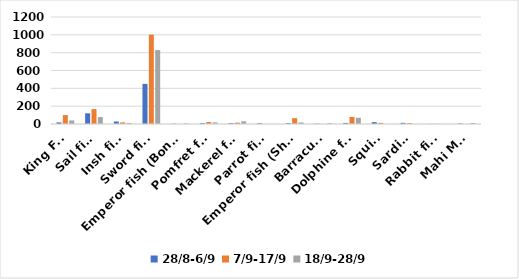
| Category | 28/8-6/9 | 7/9-17/9 | 18/9-28/9 |
|---|---|---|---|
| King Fsh  | 18 | 100 | 40 |
| Sail fish | 120 | 167 | 78 |
| Insh fish | 28 | 18 | 12 |
| Sword fish | 450 | 1002 | 829 |
| Emperor fish (Bonqus) | 3 | 0 | 6 |
| Pomfret fish | 10 | 22 | 18 |
| Mackerel fish | 10 | 15 | 30 |
| Parrot fish | 9 | 0 | 0 |
| Emperor fish (Shour | 10 | 66 | 18 |
| Barracuda | 4 | 0 | 10 |
| Dolphine fish | 12 | 79 | 70 |
| Squid  | 21 | 13 | 0 |
| Sardina | 13 | 10 | 0 |
| Rabbit fish | 1.5 | 2 | 0 |
| Mahi Mahi | 6 | 0 | 11 |